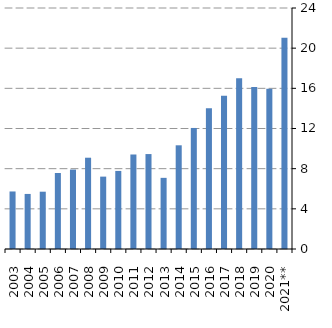
| Category | Series 0 |
|---|---|
| 2003 | 5728829.299 |
| 2004 | 5483091.44 |
| 2005 | 5706750.844 |
| 2006 | 7567057.963 |
| 2007 | 7908375.832 |
| 2008 | 9090761.114 |
| 2009 | 7207690.034 |
| 2010 | 7775258.75 |
| 2011 | 9411545.453 |
| 2012 | 9454329.634 |
| 2013 | 7085322.03 |
| 2014 | 10326845.738 |
| 2015 | 12053310.347 |
| 2016 | 14018155.86 |
| 2017 | 15262388.75 |
| 2018 | 17009763.168 |
| 2019 | 16126204.279 |
| 2020 | 15964146.928 |
| 2021** | 21031370.889 |